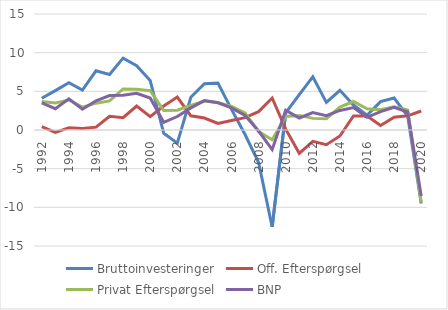
| Category | Bruttoinvesteringer | Off. Efterspørgsel | Privat Efterspørgsel | BNP |
|---|---|---|---|---|
| 1992 | 4.1 | 0.446 | 3.68 | 3.522 |
| 1993 | 5.095 | -0.3 | 3.484 | 2.753 |
| 1994 | 6.105 | 0.286 | 3.874 | 4.029 |
| 1995 | 5.156 | 0.206 | 2.951 | 2.684 |
| 1996 | 7.654 | 0.371 | 3.47 | 3.773 |
| 1997 | 7.181 | 1.777 | 3.766 | 4.447 |
| 1998 | 9.294 | 1.598 | 5.311 | 4.481 |
| 1999 | 8.324 | 3.103 | 5.267 | 4.753 |
| 2000 | 6.398 | 1.721 | 5.082 | 4.127 |
| 2001 | -0.423 | 3.101 | 2.519 | 0.998 |
| 2002 | -1.696 | 4.266 | 2.569 | 1.742 |
| 2003 | 4.237 | 1.839 | 3.178 | 2.861 |
| 2004 | 5.993 | 1.544 | 3.752 | 3.799 |
| 2005 | 6.059 | 0.839 | 3.562 | 3.513 |
| 2006 | 2.674 | 1.221 | 3.063 | 2.855 |
| 2007 | -0.579 | 1.6 | 2.223 | 1.876 |
| 2008 | -4.206 | 2.372 | -0.212 | -0.137 |
| 2009 | -12.522 | 4.137 | -1.254 | -2.537 |
| 2010 | 2.232 | 0.11 | 1.75 | 2.564 |
| 2011 | 4.576 | -3.018 | 1.887 | 1.551 |
| 2012 | 6.87 | -1.458 | 1.503 | 2.25 |
| 2013 | 3.568 | -1.896 | 1.454 | 1.842 |
| 2014 | 5.133 | -0.778 | 2.96 | 2.526 |
| 2015 | 3.23 | 1.821 | 3.686 | 2.908 |
| 2016 | 1.899 | 1.8 | 2.737 | 1.638 |
| 2017 | 3.669 | 0.58 | 2.609 | 2.37 |
| 2018 | 4.134 | 1.654 | 3.005 | 2.927 |
| 2019 | 1.801 | 1.828 | 2.592 | 2.333 |
| 2020 | -9.511 | 2.455 | -9.371 | -8.54 |